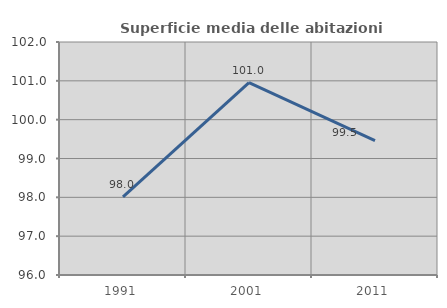
| Category | Superficie media delle abitazioni occupate |
|---|---|
| 1991.0 | 98.014 |
| 2001.0 | 100.955 |
| 2011.0 | 99.463 |